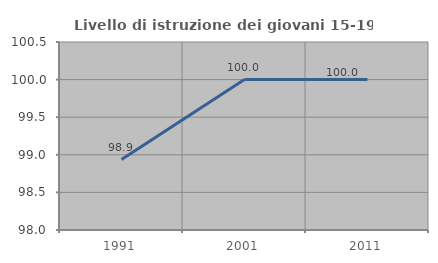
| Category | Livello di istruzione dei giovani 15-19 anni |
|---|---|
| 1991.0 | 98.936 |
| 2001.0 | 100 |
| 2011.0 | 100 |